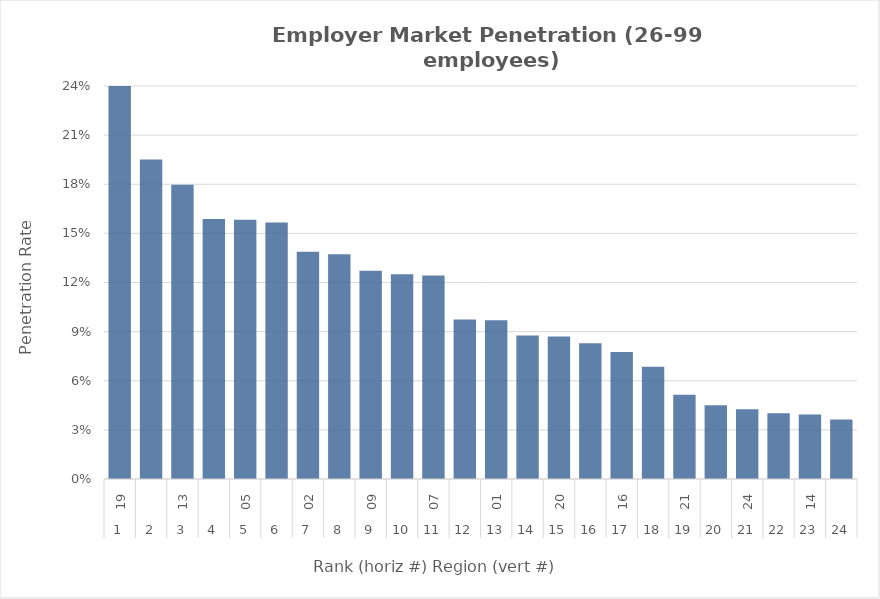
| Category | Rate |
|---|---|
| 0 | 0.274 |
| 1 | 0.195 |
| 2 | 0.18 |
| 3 | 0.159 |
| 4 | 0.158 |
| 5 | 0.157 |
| 6 | 0.139 |
| 7 | 0.137 |
| 8 | 0.127 |
| 9 | 0.125 |
| 10 | 0.124 |
| 11 | 0.097 |
| 12 | 0.097 |
| 13 | 0.088 |
| 14 | 0.087 |
| 15 | 0.083 |
| 16 | 0.078 |
| 17 | 0.069 |
| 18 | 0.051 |
| 19 | 0.045 |
| 20 | 0.043 |
| 21 | 0.04 |
| 22 | 0.039 |
| 23 | 0.036 |